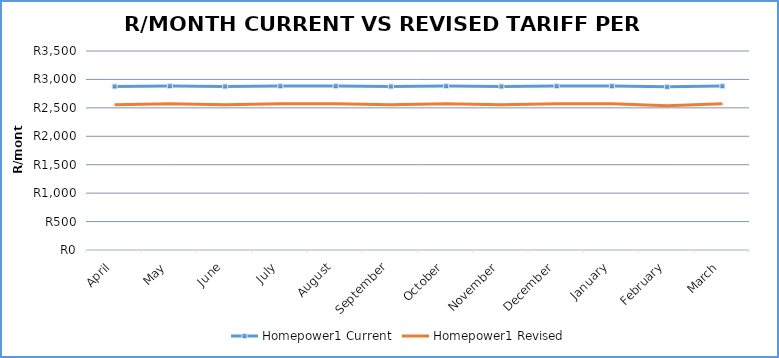
| Category | Homepower1 Current | Homepower1 Revised |
|---|---|---|
| April | 2876.76 | 2554.479 |
| May | 2882.49 | 2572.989 |
| June | 2876.76 | 2554.479 |
| July | 2882.49 | 2572.989 |
| August | 2882.49 | 2572.989 |
| September | 2876.76 | 2554.479 |
| October | 2882.49 | 2572.989 |
| November | 2876.76 | 2554.479 |
| December | 2882.49 | 2572.989 |
| January | 2882.49 | 2572.989 |
| February | 2871.03 | 2535.969 |
| March | 2882.49 | 2572.989 |